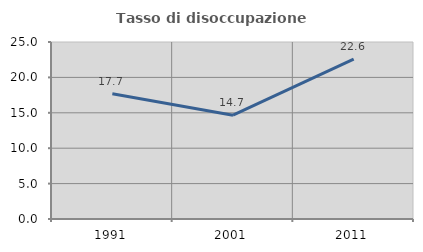
| Category | Tasso di disoccupazione giovanile  |
|---|---|
| 1991.0 | 17.683 |
| 2001.0 | 14.667 |
| 2011.0 | 22.581 |